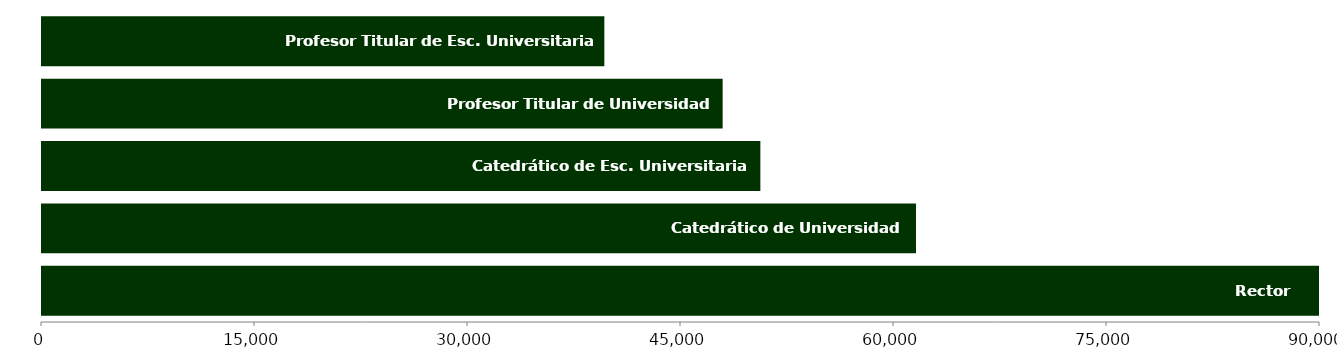
| Category | Series 3 |
|---|---|
| Rector | 90975.53 |
| Catedrático de Universidad | 61547.741 |
| Catedrático de Esc. Universitaria | 50589.23 |
| Profesor Titular de Universidad | 47933.556 |
| Profesor Titular de Esc. Universitaria | 39601.359 |